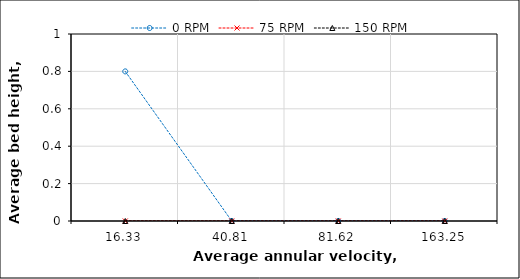
| Category | 0 RPM | 75 RPM | 150 RPM |
|---|---|---|---|
| 16.33 | 0.8 | 0 | 0 |
| 40.81 | 0 | 0 | 0 |
| 81.62 | 0 | 0 | 0 |
| 163.25 | 0 | 0 | 0 |